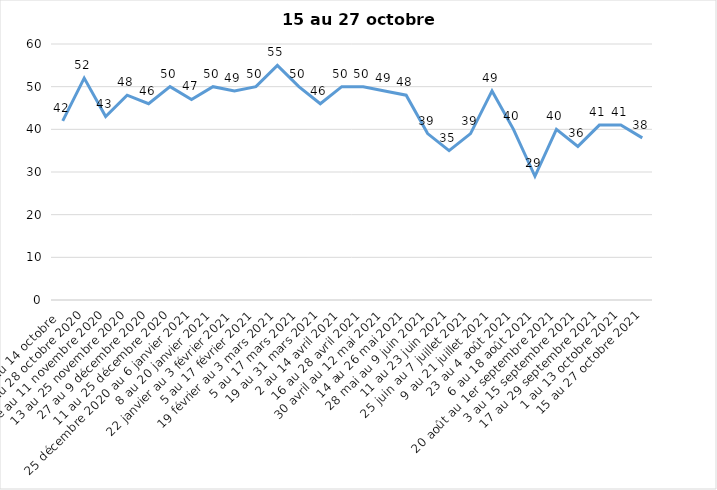
| Category | Toujours aux trois mesures |
|---|---|
| 2 au 14 octobre  | 42 |
| 16 au 28 octobre 2020 | 52 |
| 30 octobre au 11 novembre 2020 | 43 |
| 13 au 25 novembre 2020 | 48 |
| 27 au 9 décembre 2020 | 46 |
| 11 au 25 décembre 2020 | 50 |
| 25 décembre 2020 au 6 janvier 2021 | 47 |
| 8 au 20 janvier 2021 | 50 |
| 22 janvier au 3 février 2021 | 49 |
| 5 au 17 février 2021 | 50 |
| 19 février au 3 mars 2021 | 55 |
| 5 au 17 mars 2021 | 50 |
| 19 au 31 mars 2021 | 46 |
| 2 au 14 avril 2021 | 50 |
| 16 au 28 avril 2021 | 50 |
| 30 avril au 12 mai 2021 | 49 |
| 14 au 26 mai 2021 | 48 |
| 28 mai au 9 juin 2021 | 39 |
| 11 au 23 juin 2021 | 35 |
| 25 juin au 7 juillet 2021 | 39 |
| 9 au 21 juillet 2021 | 49 |
| 23 au 4 août 2021 | 40 |
| 6 au 18 août 2021 | 29 |
| 20 août au 1er septembre 2021 | 40 |
| 3 au 15 septembre 2021 | 36 |
| 17 au 29 septembre 2021 | 41 |
| 1 au 13 octobre 2021 | 41 |
| 15 au 27 octobre 2021 | 38 |